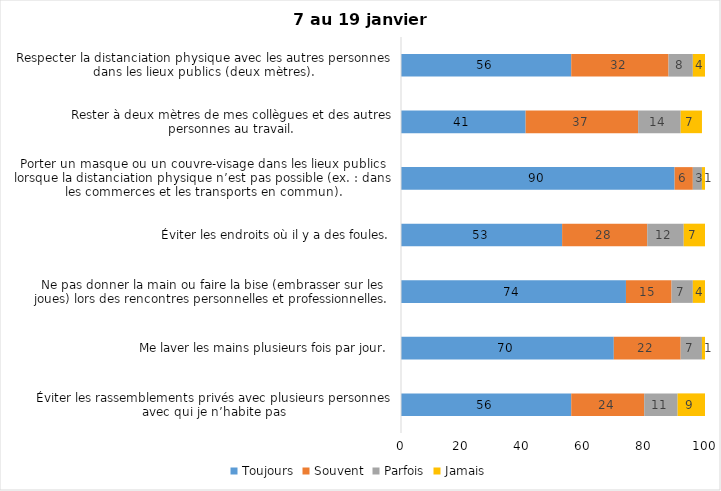
| Category | Toujours | Souvent | Parfois | Jamais |
|---|---|---|---|---|
| Éviter les rassemblements privés avec plusieurs personnes avec qui je n’habite pas | 56 | 24 | 11 | 9 |
| Me laver les mains plusieurs fois par jour. | 70 | 22 | 7 | 1 |
| Ne pas donner la main ou faire la bise (embrasser sur les joues) lors des rencontres personnelles et professionnelles. | 74 | 15 | 7 | 4 |
| Éviter les endroits où il y a des foules. | 53 | 28 | 12 | 7 |
| Porter un masque ou un couvre-visage dans les lieux publics lorsque la distanciation physique n’est pas possible (ex. : dans les commerces et les transports en commun). | 90 | 6 | 3 | 1 |
| Rester à deux mètres de mes collègues et des autres personnes au travail. | 41 | 37 | 14 | 7 |
| Respecter la distanciation physique avec les autres personnes dans les lieux publics (deux mètres). | 56 | 32 | 8 | 4 |